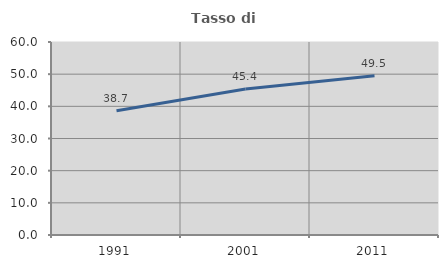
| Category | Tasso di occupazione   |
|---|---|
| 1991.0 | 38.652 |
| 2001.0 | 45.388 |
| 2011.0 | 49.474 |